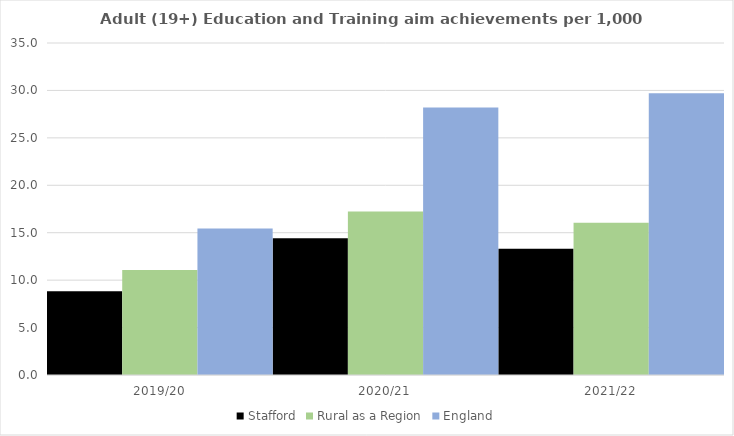
| Category | Stafford | Rural as a Region | England |
|---|---|---|---|
| 2019/20 | 8.841 | 11.081 | 15.446 |
| 2020/21 | 14.424 | 17.224 | 28.211 |
| 2021/22 | 13.316 | 16.063 | 29.711 |